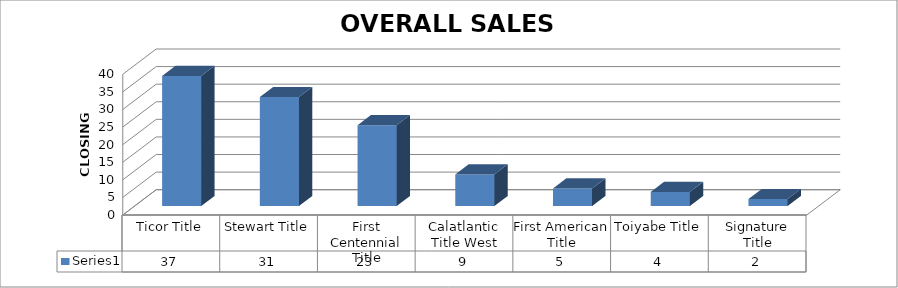
| Category | Series 0 |
|---|---|
| Ticor Title | 37 |
| Stewart Title | 31 |
| First Centennial Title | 23 |
| Calatlantic Title West | 9 |
| First American Title | 5 |
| Toiyabe Title | 4 |
| Signature Title | 2 |